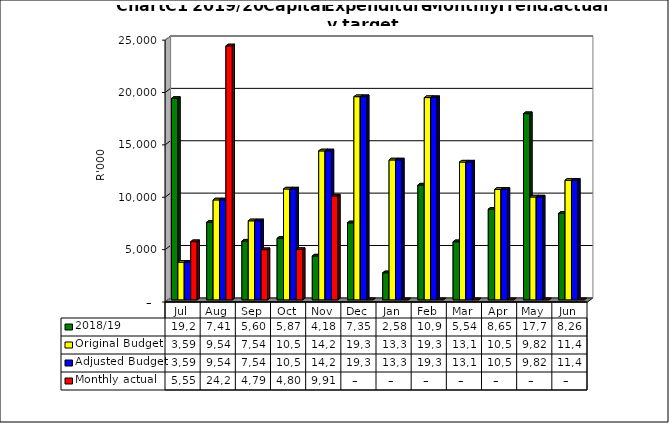
| Category | 2018/19 | Original Budget | Adjusted Budget | Monthly actual |
|---|---|---|---|---|
| Jul | 19231011.37 | 3597000 | 3597000 | 5554740.23 |
| Aug | 7413792.52 | 9540000 | 9540000 | 24246351.16 |
| Sep | 5606695.82 | 7545000 | 7545000 | 4790238.71 |
| Oct | 5872546.52 | 10583000 | 10583000 | 4804471.47 |
| Nov | 4185356.82 | 14220000 | 14220000 | 9915031.46 |
| Dec | 7353836.19 | 19396000 | 19396000 | 0 |
| Jan | 2583015.59 | 13356000 | 13356000 | 0 |
| Feb | 10959701.7 | 19309000 | 19309000 | 0 |
| Mar | 5548374.54 | 13155000 | 13155000 | 0 |
| Apr | 8654474.54 | 10547000 | 10547000 | 0 |
| May | 17774802.17 | 9821000 | 9821000 | 0 |
| Jun | 8264280 | 11417000 | 11417000 | 0 |